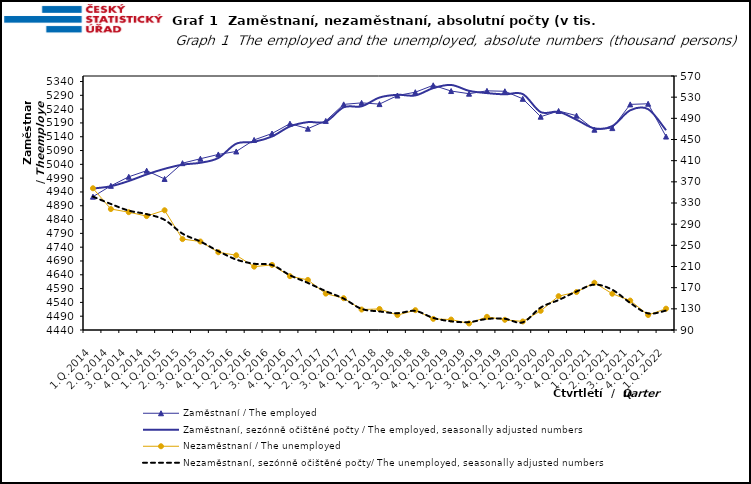
| Category | Zaměstnaní / The employed | Zaměstnaní, sezónně očištěné počty / The employed, seasonally adjusted numbers |
|---|---|---|
| 1.Q.2014 | 4922.963 | 4952.405 |
| 2.Q.2014 | 4962.219 | 4960.65 |
| 3.Q.2014 | 4994.947 | 4979.618 |
| 4.Q.2014 | 5017.051 | 5003.629 |
| 1.Q.2015 | 4987.141 | 5023.827 |
| 2.Q.2015 | 5044.285 | 5038.984 |
| 3.Q.2015 | 5060.3 | 5045.647 |
| 4.Q.2015 | 5075.884 | 5063.085 |
| 1.Q.2016 | 5086.671 | 5114.698 |
| 2.Q.2016 | 5128.493 | 5121.602 |
| 3.Q.2016 | 5151.712 | 5140.967 |
| 4.Q.2016 | 5187.436 | 5177.35 |
| 1.Q.2017 | 5169.203 | 5192.941 |
| 2.Q.2017 | 5197.265 | 5194.555 |
| 3.Q.2017 | 5257.26 | 5246.726 |
| 4.Q.2017 | 5262.691 | 5250.237 |
| 1.Q.2018 | 5258.225 | 5281.99 |
| 2.Q.2018 | 5289.242 | 5291.982 |
| 3.Q.2018 | 5301.361 | 5289.641 |
| 4.Q.2018 | 5326.327 | 5316.128 |
| 1.Q.2019 | 5305.534 | 5327.565 |
| 2.Q.2019 | 5295.929 | 5306.306 |
| 3.Q.2019 | 5306.247 | 5298.103 |
| 4.Q.2019 | 5304.7 | 5293.467 |
| 1.Q.2020 | 5277.418 | 5294.602 |
| 2.Q.2020 | 5212.593 | 5229.332 |
| 3.Q.2020 | 5233.335 | 5230.287 |
| 4.Q.2020 | 5216.403 | 5201.67 |
| 1.Q.2021 | 5165.582 | 5170.334 |
| 2.Q.2021 | 5171.264 | 5178.592 |
| 3.Q.2021 | 5257.199 | 5235.825 |
| 4.Q.2021 | 5259.43 | 5239.857 |
| 1.Q.2022 | 5140.696 | 5163.642 |